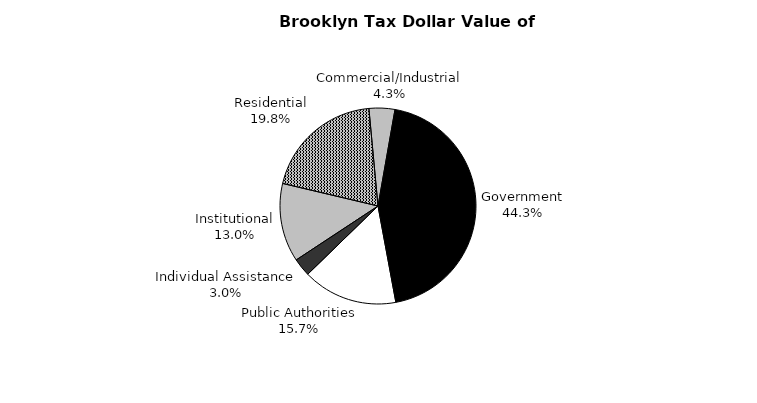
| Category | Series 0 |
|---|---|
| Government | 1438470511 |
| Public Authorities | 508194933 |
| Individual Assistance | 97126231 |
| Institutional | 421390710 |
| Residential | 643516806 |
| Commercial/Industrial | 138323737 |